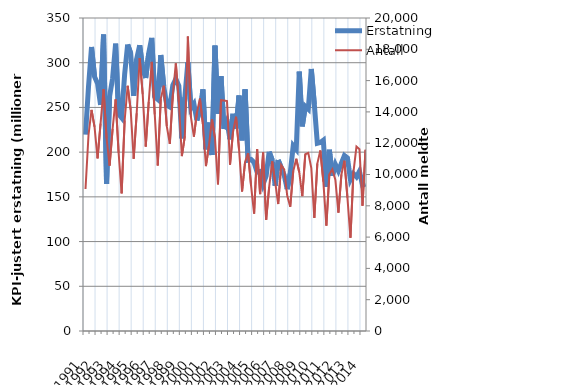
| Category | Erstatning |
|---|---|
| 1991.0 | 219.586 |
| nan | 273.204 |
| nan | 317.524 |
| nan | 284.387 |
| 1992.0 | 276.835 |
| nan | 252.95 |
| nan | 331.491 |
| nan | 164.406 |
| 1993.0 | 262.273 |
| nan | 282.589 |
| nan | 321.28 |
| nan | 242.592 |
| 1994.0 | 238.463 |
| nan | 287.132 |
| nan | 320.273 |
| nan | 310.718 |
| 1995.0 | 263.084 |
| nan | 304.339 |
| nan | 319.599 |
| nan | 292.658 |
| 1996.0 | 282.931 |
| nan | 310.593 |
| nan | 327.701 |
| nan | 261.99 |
| 1997.0 | 259.021 |
| nan | 308.509 |
| nan | 273.07 |
| nan | 252.443 |
| 1998.0 | 250.561 |
| nan | 274.861 |
| nan | 281.847 |
| nan | 274.264 |
| 1999.0 | 215.461 |
| nan | 261.441 |
| nan | 300.465 |
| nan | 249.21 |
| 2000.0 | 254.031 |
| nan | 235.584 |
| nan | 247.117 |
| nan | 270.159 |
| 2001.0 | 203.157 |
| nan | 233.013 |
| nan | 196.769 |
| nan | 319.142 |
| 2002.0 | 242.984 |
| nan | 284.87 |
| nan | 225.911 |
| nan | 234.548 |
| 2003.0 | 214.298 |
| nan | 242.827 |
| nan | 226.425 |
| nan | 263.275 |
| 2004.0 | 213.218 |
| nan | 270.293 |
| nan | 190.968 |
| nan | 191.765 |
| 2005.0 | 188.494 |
| nan | 177.652 |
| nan | 178.389 |
| nan | 164.279 |
| 2006.0 | 173.332 |
| nan | 200.446 |
| nan | 191.175 |
| nan | 162.506 |
| 2007.0 | 191.192 |
| nan | 182.639 |
| nan | 174.187 |
| nan | 158.64 |
| 2008.0 | 176.254 |
| nan | 207.24 |
| nan | 203.099 |
| nan | 290.139 |
| 2009.0 | 228.892 |
| nan | 251.211 |
| nan | 248.067 |
| nan | 292.993 |
| 2010.0 | 253.489 |
| nan | 209.889 |
| nan | 210.751 |
| nan | 213.264 |
| 2011.0 | 161.308 |
| nan | 202.632 |
| nan | 173.506 |
| nan | 186.238 |
| 2012.0 | 179.074 |
| nan | 187.704 |
| nan | 196.168 |
| nan | 193.591 |
| 2013.0 | 169.362 |
| nan | 176.036 |
| nan | 172.418 |
| nan | 178.636 |
| 2014.0 | 163.217 |
| nan | 164.261 |